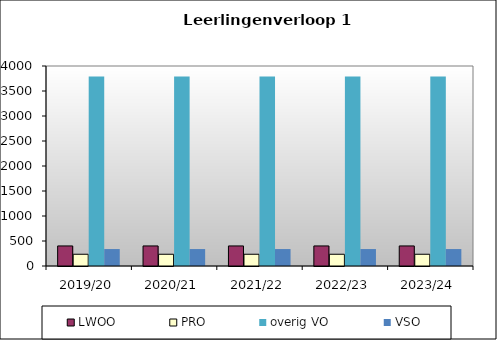
| Category | LWOO | PRO | overig VO | VSO |
|---|---|---|---|---|
| 2019/20 | 401 | 235 | 3791.5 | 339 |
| 2020/21 | 401 | 235 | 3791.5 | 339 |
| 2021/22 | 401 | 235 | 3791.5 | 339 |
| 2022/23 | 401 | 235 | 3791.5 | 339 |
| 2023/24 | 401 | 235 | 3791.5 | 339 |